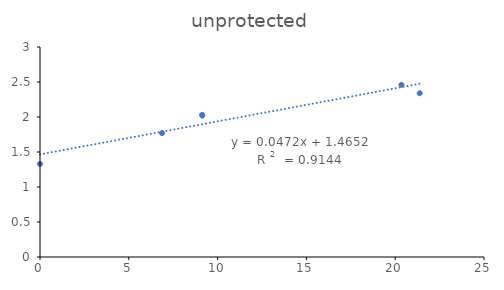
| Category | protected |
|---|---|
| 0.0 | 1.33 |
| 20.35 | 2.46 |
| 21.38 | 2.34 |
| 9.14 | 2.02 |
| 9.13 | 2.03 |
| 6.87 | 1.77 |